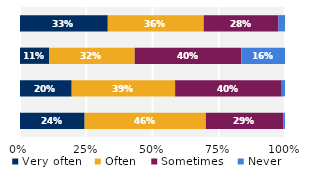
| Category | Very often | Often | Sometimes | Never |
|---|---|---|---|---|
| Talked about students' career plans | 0.331 | 0.362 | 0.282 | 0.025 |
| Worked on activities other than 
coursework | 0.11 | 0.323 | 0.402 | 0.165 |
| Discussed course topics, ideas, or concepts 
outside of class | 0.195 | 0.39 | 0.402 | 0.012 |
| Discussed students' academic performance | 0.244 | 0.457 | 0.293 | 0.006 |